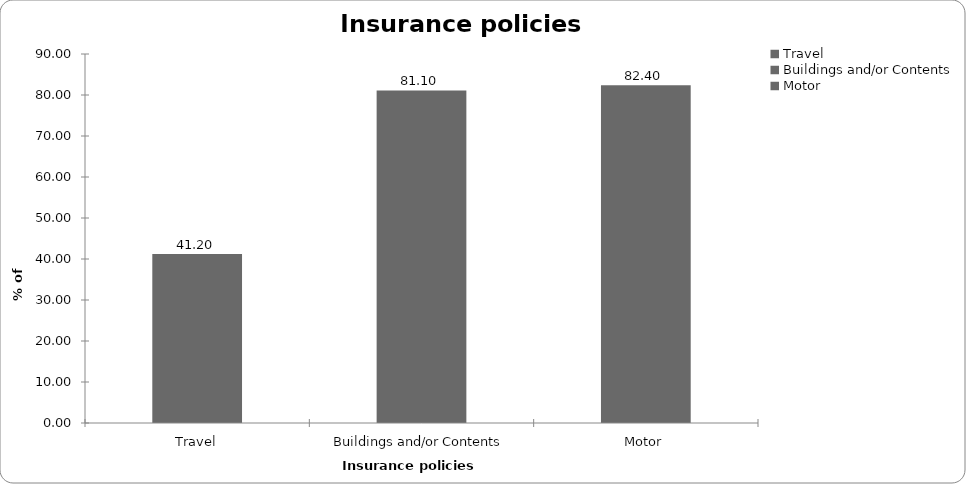
| Category | Insurance policies held |
|---|---|
| Travel | 41.2 |
| Buildings and/or Contents | 81.1 |
| Motor | 82.4 |